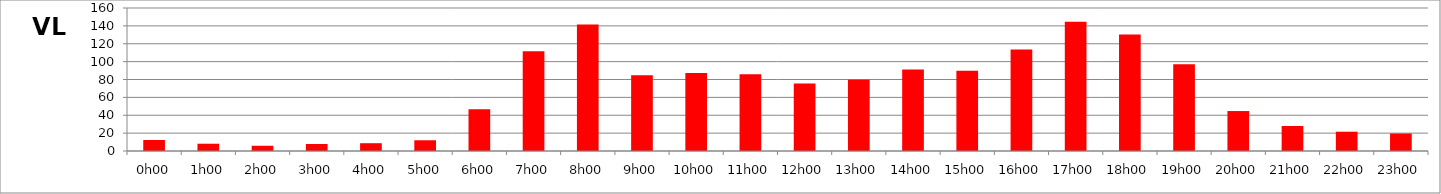
| Category | VL |
|---|---|
| 0.0 | 12.286 |
| 0.041666666666666664 | 8.143 |
| 0.08333333333333333 | 5.857 |
| 0.125 | 7.857 |
| 0.16666666666666666 | 8.714 |
| 0.20833333333333334 | 12 |
| 0.25 | 46.714 |
| 0.2916666666666667 | 111.571 |
| 0.3333333333333333 | 141.571 |
| 0.375 | 84.857 |
| 0.4166666666666667 | 87.286 |
| 0.4583333333333333 | 86 |
| 0.5 | 75.571 |
| 0.5416666666666666 | 79.857 |
| 0.5833333333333334 | 91.286 |
| 0.625 | 89.857 |
| 0.6666666666666666 | 113.429 |
| 0.7083333333333334 | 144.714 |
| 0.75 | 130.286 |
| 0.7916666666666666 | 97 |
| 0.8333333333333334 | 44.714 |
| 0.875 | 28 |
| 0.9166666666666666 | 21.571 |
| 0.9583333333333334 | 19.571 |